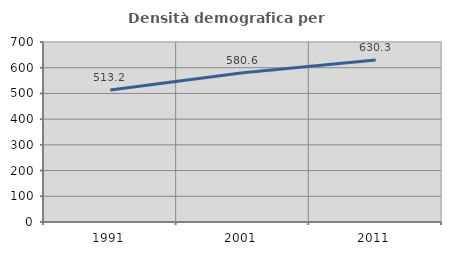
| Category | Densità demografica |
|---|---|
| 1991.0 | 513.247 |
| 2001.0 | 580.636 |
| 2011.0 | 630.252 |